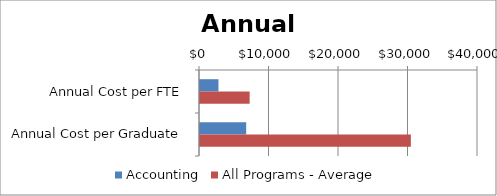
| Category | Accounting | All Programs - Average |
|---|---|---|
| Annual Cost per FTE | 2658.121 | 7144 |
| Annual Cost per Graduate | 6645.301 | 30340 |